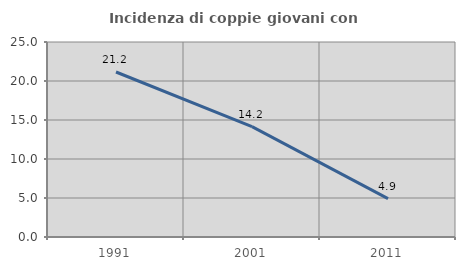
| Category | Incidenza di coppie giovani con figli |
|---|---|
| 1991.0 | 21.154 |
| 2001.0 | 14.151 |
| 2011.0 | 4.918 |